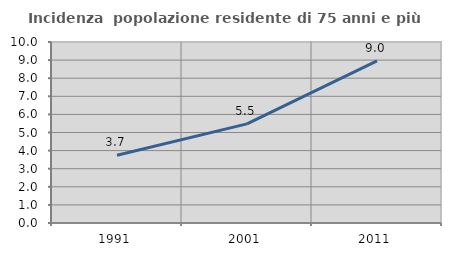
| Category | Incidenza  popolazione residente di 75 anni e più |
|---|---|
| 1991.0 | 3.744 |
| 2001.0 | 5.478 |
| 2011.0 | 8.959 |